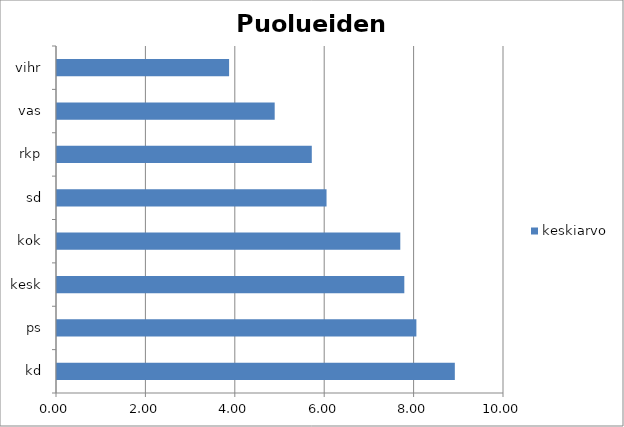
| Category | keskiarvo |
|---|---|
| kd | 8.9 |
| ps | 8.04 |
| kesk | 7.77 |
| kok | 7.68 |
| sd | 6.03 |
| rkp | 5.7 |
| vas | 4.87 |
| vihr | 3.85 |